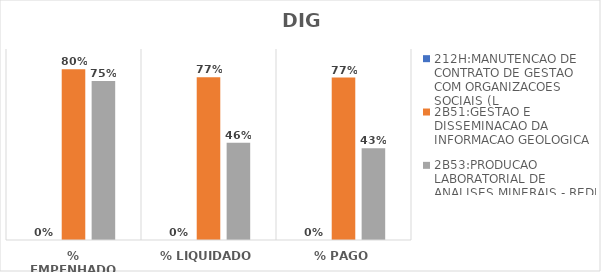
| Category | 212H:MANUTENCAO DE CONTRATO DE GESTAO COM ORGANIZACOES SOCIAIS (L | 2B51:GESTAO E DISSEMINACAO DA INFORMACAO GEOLOGICA | 2B53:PRODUCAO LABORATORIAL DE ANALISES MINERAIS - REDE LAMIN |
|---|---|---|---|
| % EMPENHADO | 0 | 0.804 | 0.75 |
| % LIQUIDADO | 0 | 0.767 | 0.458 |
| % PAGO | 0 | 0.765 | 0.433 |